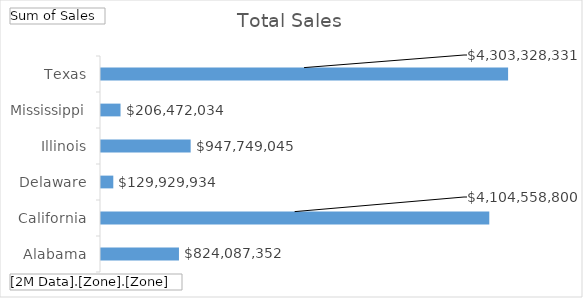
| Category | Total |
|---|---|
| Alabama | 824087351.84 |
| California | 4104558800.17 |
| Delaware | 129929934.07 |
| Illinois | 947749044.68 |
| Mississippi | 206472034.2 |
| Texas | 4303328330.91 |